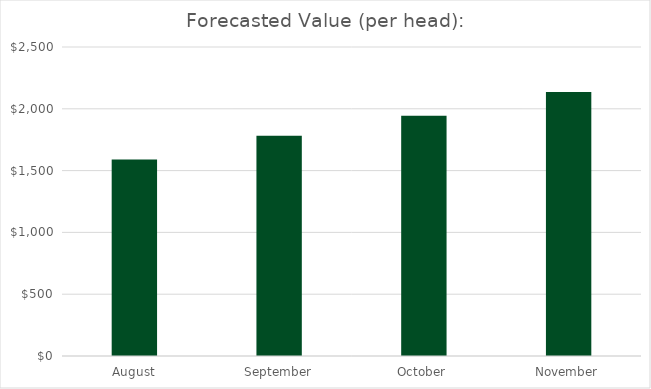
| Category | Series 0 |
|---|---|
| August | 1589.036 |
| September | 1781.111 |
| October | 1944.78 |
| November | 2135.346 |